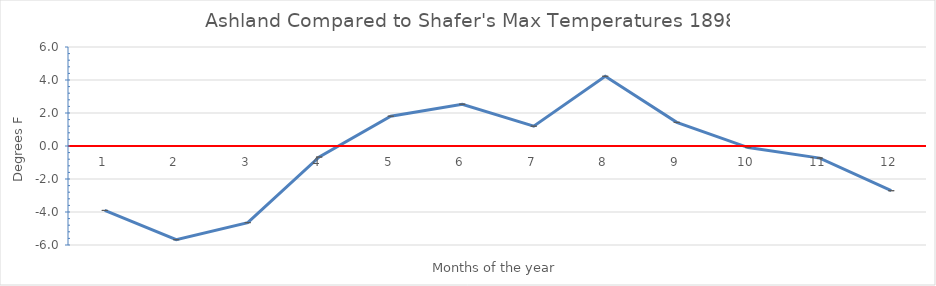
| Category | Series 0 |
|---|---|
| 0 | -3.903 |
| 1 | -5.679 |
| 2 | -4.645 |
| 3 | -0.667 |
| 4 | 1.806 |
| 5 | 2.533 |
| 6 | 1.2 |
| 7 | 4.226 |
| 8 | 1.433 |
| 9 | -0.097 |
| 10 | -0.733 |
| 11 | -2.71 |